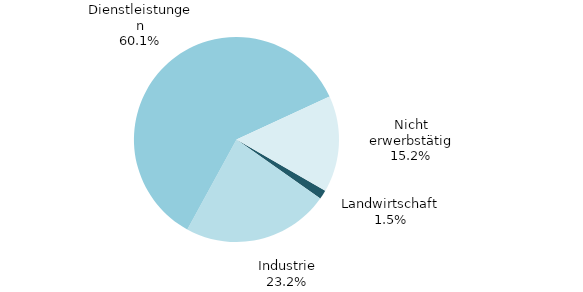
| Category | Series 0 |
|---|---|
| Landwirtschaft | 4 |
| Industrie | 64 |
| Dienstleistungen | 166 |
| Nicht erwerbstätig | 42 |